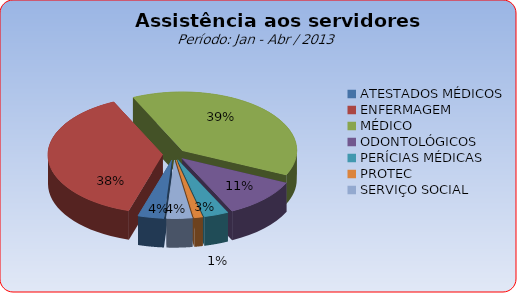
| Category | Series 0 |
|---|---|
| ATESTADOS MÉDICOS | 3.655 |
| ENFERMAGEM | 38.207 |
| MÉDICO | 38.889 |
| ODONTOLÓGICOS | 10.965 |
| PERÍCIAS MÉDICAS | 3.46 |
| PROTEC | 1.218 |
| SERVIÇO SOCIAL | 3.606 |